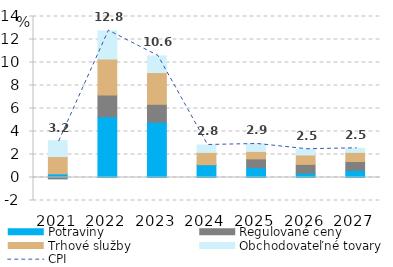
| Category | Potraviny | Regulované ceny | Trhové služby | Obchodovateľné tovary |
|---|---|---|---|---|
| 2021.0 | 0.315 | -0.122 | 1.506 | 1.381 |
| 2022.0 | 5.278 | 1.895 | 3.13 | 2.444 |
| 2023.0 | 4.807 | 1.56 | 2.76 | 1.45 |
| 2024.0 | 1.109 | 0.005 | 1.069 | 0.645 |
| 2025.0 | 0.855 | 0.766 | 0.647 | 0.648 |
| 2026.0 | 0.375 | 0.766 | 0.821 | 0.498 |
| 2027.0 | 0.622 | 0.766 | 0.797 | 0.355 |